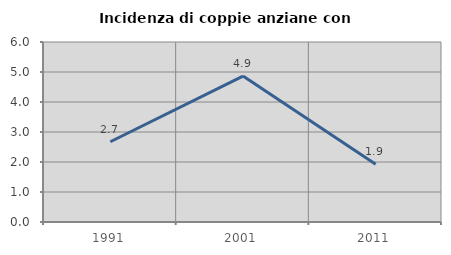
| Category | Incidenza di coppie anziane con figli |
|---|---|
| 1991.0 | 2.676 |
| 2001.0 | 4.863 |
| 2011.0 | 1.923 |